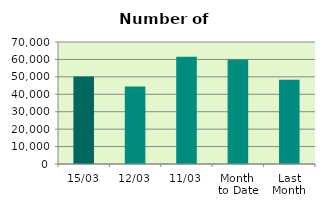
| Category | Series 0 |
|---|---|
| 15/03 | 50174 |
| 12/03 | 44410 |
| 11/03 | 61468 |
| Month 
to Date | 59937.818 |
| Last
Month | 48363.3 |